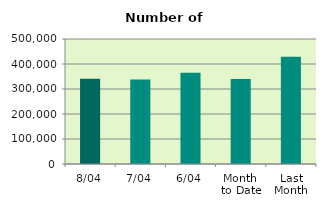
| Category | Series 0 |
|---|---|
| 8/04 | 340982 |
| 7/04 | 337532 |
| 6/04 | 364896 |
| Month 
to Date | 340207.667 |
| Last
Month | 428970.609 |